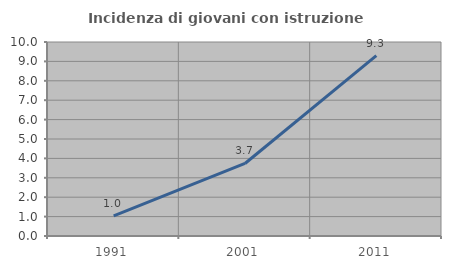
| Category | Incidenza di giovani con istruzione universitaria |
|---|---|
| 1991.0 | 1.042 |
| 2001.0 | 3.738 |
| 2011.0 | 9.302 |